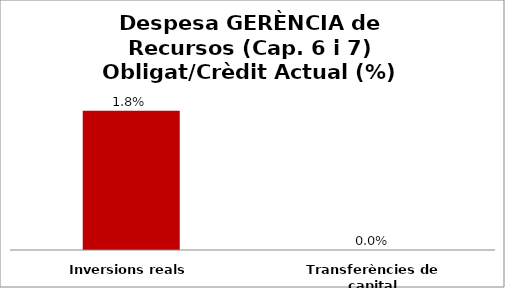
| Category | Series 0 |
|---|---|
| Inversions reals | 0.018 |
| Transferències de capital | 0 |